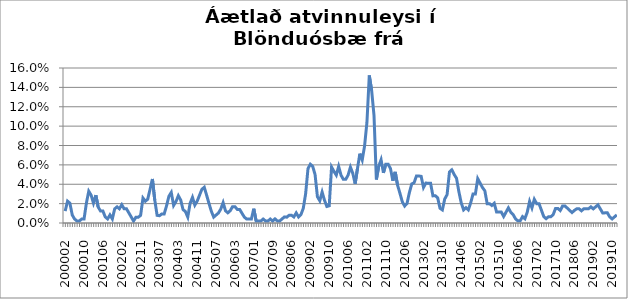
| Category | Series 0 |
|---|---|
| 200002 | 0.012 |
| 200003 | 0.023 |
| 200004 | 0.02 |
| 200005 | 0.008 |
| 200006 | 0.004 |
| 200007 | 0.002 |
| 200008 | 0.002 |
| 200009 | 0.004 |
| 200010 | 0.004 |
| 200011 | 0.02 |
| 200012 | 0.033 |
| 200101 | 0.029 |
| 200102 | 0.021 |
| 200103 | 0.029 |
| 200104 | 0.016 |
| 200105 | 0.012 |
| 200106 | 0.012 |
| 200107 | 0.006 |
| 200108 | 0.004 |
| 200109 | 0.008 |
| 200110 | 0.004 |
| 200111 | 0.015 |
| 200112 | 0.017 |
| 200201 | 0.015 |
| 200202 | 0.019 |
| 200203 | 0.015 |
| 200204 | 0.015 |
| 200205 | 0.01 |
| 200206 | 0.006 |
| 200208 | 0.002 |
| 200209 | 0.006 |
| 200210 | 0.006 |
| 200211 | 0.008 |
| 200212 | 0.026 |
| 200301 | 0.022 |
| 200302 | 0.024 |
| 200303 | 0.035 |
| 200304 | 0.045 |
| 200305 | 0.024 |
| 200306 | 0.008 |
| 200307 | 0.008 |
| 200308 | 0.009 |
| 200309 | 0.009 |
| 200310 | 0.018 |
| 200311 | 0.028 |
| 200312 | 0.032 |
| 200401 | 0.018 |
| 200402 | 0.022 |
| 200403 | 0.028 |
| 200404 | 0.024 |
| 200405 | 0.014 |
| 200406 | 0.012 |
| 200407 | 0.006 |
| 200408 | 0.02 |
| 200409 | 0.026 |
| 200410 | 0.018 |
| 200411 | 0.023 |
| 200412 | 0.029 |
| 200501 | 0.035 |
| 200502 | 0.037 |
| 200503 | 0.029 |
| 200504 | 0.02 |
| 200505 | 0.012 |
| 200506 | 0.006 |
| 200507 | 0.008 |
| 200508 | 0.01 |
| 200509 | 0.014 |
| 200510 | 0.021 |
| 200511 | 0.013 |
| 200512 | 0.011 |
| 200601 | 0.013 |
| 200602 | 0.017 |
| 200603 | 0.017 |
| 200604 | 0.014 |
| 200605 | 0.014 |
| 200606 | 0.01 |
| 200607 | 0.006 |
| 200608 | 0.004 |
| 200609 | 0.004 |
| 200612 | 0.004 |
| 200701 | 0.015 |
| 200702 | 0.002 |
| 200703 | 0.002 |
| 200704 | 0.002 |
| 200705 | 0.004 |
| 200706 | 0.002 |
| 200707 | 0.002 |
| 200708 | 0.004 |
| 200709 | 0.002 |
| 200711 | 0.004 |
| 200712 | 0.002 |
| 200801 | 0.002 |
| 200802 | 0.004 |
| 200803 | 0.006 |
| 200804 | 0.006 |
| 200805 | 0.008 |
| 200806 | 0.008 |
| 200807 | 0.006 |
| 200808 | 0.01 |
| 200809 | 0.006 |
| 200810 | 0.009 |
| 200811 | 0.015 |
| 200812 | 0.03 |
| 200901 | 0.056 |
| 200902 | 0.061 |
| 200903 | 0.058 |
| 200904 | 0.05 |
| 200905 | 0.027 |
| 200906 | 0.023 |
| 200907 | 0.032 |
| 200908 | 0.023 |
| 200909 | 0.017 |
| 200910 | 0.018 |
| 200911 | 0.058 |
| 200912 | 0.053 |
| 201001 | 0.049 |
| 201002 | 0.058 |
| 201003 | 0.049 |
| 201004 | 0.045 |
| 201005 | 0.045 |
| 201006 | 0.049 |
| 201007 | 0.058 |
| 201008 | 0.051 |
| 201009 | 0.041 |
| 201010 | 0.056 |
| 201011 | 0.072 |
| 201012 | 0.065 |
| 201101 | 0.079 |
| 201102 | 0.104 |
| 201103 | 0.152 |
| 201104 | 0.137 |
| 201105 | 0.111 |
| 201106 | 0.045 |
| 201107 | 0.059 |
| 201108 | 0.065 |
| 201109 | 0.052 |
| 201110 | 0.061 |
| 201111 | 0.061 |
| 201112 | 0.056 |
| 201201 | 0.044 |
| 201202 | 0.053 |
| 201203 | 0.039 |
| 201204 | 0.031 |
| 201205 | 0.022 |
| 201206 | 0.018 |
| 201207 | 0.02 |
| 201208 | 0.031 |
| 201209 | 0.04 |
| 201210 | 0.042 |
| 201211 | 0.048 |
| 201212 | 0.048 |
| 201301 | 0.048 |
| 201302 | 0.037 |
| 201303 | 0.041 |
| 201304 | 0.041 |
| 201305 | 0.041 |
| 201306 | 0.028 |
| 201307 | 0.028 |
| 201308 | 0.026 |
| 201309 | 0.015 |
| 201310 | 0.014 |
| 201311 | 0.025 |
| 201312 | 0.029 |
| 201401 | 0.053 |
| 201402 | 0.055 |
| 201403 | 0.05 |
| 201404 | 0.046 |
| 201405 | 0.032 |
| 201406 | 0.021 |
| 201407 | 0.014 |
| 201408 | 0.016 |
| 201409 | 0.014 |
| 201410 | 0.021 |
| 201411 | 0.03 |
| 201412 | 0.03 |
| 201501 | 0.046 |
| 201502 | 0.041 |
| 201503 | 0.037 |
| 201504 | 0.033 |
| 201505 | 0.02 |
| 201506 | 0.02 |
| 201507 | 0.018 |
| 201508 | 0.02 |
| 201509 | 0.011 |
| 201510 | 0.011 |
| 201511 | 0.011 |
| 201512 | 0.007 |
| 201601 | 0.011 |
| 201602 | 0.016 |
| 201603 | 0.011 |
| 201604 | 0.009 |
| 201605 | 0.004 |
| 201606 | 0.002 |
| 201607 | 0.002 |
| 201608 | 0.007 |
| 201609 | 0.004 |
| 201610 | 0.011 |
| 201611 | 0.022 |
| 201612 | 0.016 |
| 201701 | 0.024 |
| 201702 | 0.02 |
| 201703 | 0.02 |
| 201704 | 0.013 |
| 201705 | 0.007 |
| 201706 | 0.004 |
| 201707 | 0.006 |
| 201708 | 0.006 |
| 201709 | 0.009 |
| 201710 | 0.015 |
| 201711 | 0.015 |
| 201712 | 0.013 |
| 201801 | 0.018 |
| 201802 | 0.018 |
| 201803 | 0.015 |
| 201804 | 0.013 |
| 201805 | 0.011 |
| 201806 | 0.013 |
| 201807 | 0.015 |
| 201808 | 0.015 |
| 201809 | 0.013 |
| 201810 | 0.015 |
| 201811 | 0.015 |
| 201812 | 0.015 |
| 201901 | 0.017 |
| 201902 | 0.015 |
| 201903 | 0.017 |
| 201904 | 0.019 |
| 201905 | 0.015 |
| 201906 | 0.01 |
| 201907 | 0.01 |
| 201908 | 0.01 |
| 201909 | 0.006 |
| 201910 | 0.004 |
| 201911 | 0.006 |
| 201912 | 0.008 |